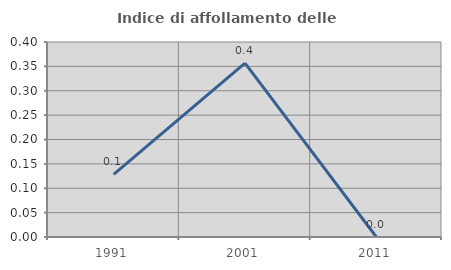
| Category | Indice di affollamento delle abitazioni  |
|---|---|
| 1991.0 | 0.129 |
| 2001.0 | 0.357 |
| 2011.0 | 0 |